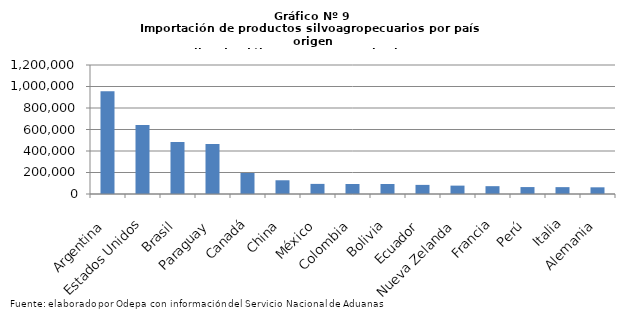
| Category | Series 0 |
|---|---|
| Argentina | 956680.395 |
| Estados Unidos | 641582.608 |
| Brasil | 483476.771 |
| Paraguay | 465092.686 |
| Canadá | 195605.435 |
| China | 127706.828 |
| México | 94013.168 |
| Colombia | 93152.313 |
| Bolivia | 93151.627 |
| Ecuador | 84781.343 |
| Nueva Zelanda | 77914.553 |
| Francia | 72813.866 |
| Perú | 64423.46 |
| Italia | 63839.074 |
| Alemania | 62196.625 |